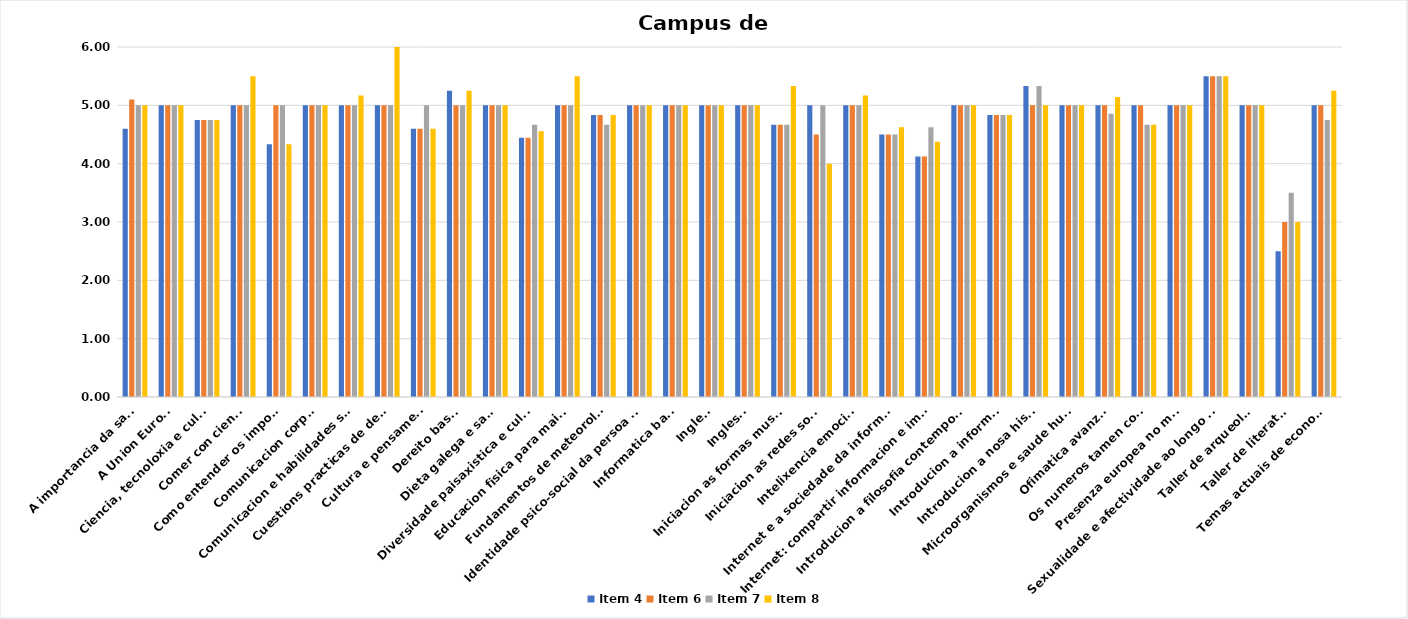
| Category | Item 4 | Item 6 | Item 7 | Item 8 |
|---|---|---|---|---|
| A importancia da saude | 4.6 | 5.1 | 5 | 5 |
| A Union Europea | 5 | 5 | 5 | 5 |
| Ciencia, tecnoloxia e cultura | 4.75 | 4.75 | 4.75 | 4.75 |
| Comer con ciencia | 5 | 5 | 5 | 5.5 |
| Como entender os impostos | 4.333 | 5 | 5 | 4.333 |
| Comunicacion corporal | 5 | 5 | 5 | 5 |
| Comunicacion e habilidades sociais | 5 | 5 | 5 | 5.167 |
| Cuestions practicas de dereito | 5 | 5 | 5 | 6 |
| Cultura e pensamento | 4.6 | 4.6 | 5 | 4.6 |
| Dereito basico | 5.25 | 5 | 5 | 5.25 |
| Dieta galega e saude | 5 | 5 | 5 | 5 |
| Diversidade paisaxistica e cultural | 4.444 | 4.444 | 4.667 | 4.556 |
| Educacion fisica para maiores | 5 | 5 | 5 | 5.5 |
| Fundamentos de meteoroloxia | 4.833 | 4.833 | 4.667 | 4.833 |
| Identidade psico-social da persoa adulta | 5 | 5 | 5 | 5 |
| Informatica basica | 5 | 5 | 5 | 5 |
| Ingles I | 5 | 5 | 5 | 5 |
| Ingles II | 5 | 5 | 5 | 5 |
| Iniciacion as formas musicais | 4.667 | 4.667 | 4.667 | 5.333 |
| Iniciacion as redes sociais | 5 | 4.5 | 5 | 4 |
| Intelixencia emocional | 5 | 5 | 5 | 5.167 |
| Internet e a sociedade da informacion | 4.5 | 4.5 | 4.5 | 4.625 |
| Internet: compartir informacion e imaxes na rede | 4.125 | 4.125 | 4.625 | 4.375 |
| Introducion a filosofia contemporanea | 5 | 5 | 5 | 5 |
| Introducion a informatica | 4.833 | 4.833 | 4.833 | 4.833 |
| Introducion a nosa historia | 5.333 | 5 | 5.333 | 5 |
| Microorganismos e saude humana | 5 | 5 | 5 | 5 |
| Ofimatica avanzada | 5 | 5 | 4.857 | 5.143 |
| Os numeros tamen contan | 5 | 5 | 4.667 | 4.667 |
| Presenza europea no mundo | 5 | 5 | 5 | 5 |
| Sexualidade e afectividade ao longo do ciclo vital | 5.5 | 5.5 | 5.5 | 5.5 |
| Taller de arqueoloxia | 5 | 5 | 5 | 5 |
| Taller de literatura | 2.5 | 3 | 3.5 | 3 |
| Temas actuais de economia | 5 | 5 | 4.75 | 5.25 |